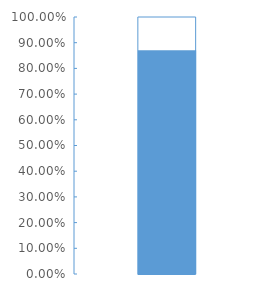
| Category | Achieved % |
|---|---|
| 0 | 0.87 |